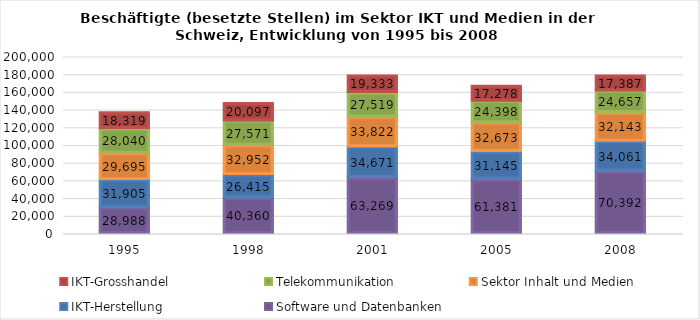
| Category | Software und Datenbanken | IKT-Herstellung | Sektor Inhalt und Medien | Telekommunikation | IKT-Grosshandel |
|---|---|---|---|---|---|
| 1995.0 | 28988 | 31905 | 29695 | 28040 | 18319 |
| 1998.0 | 40360 | 26415 | 32952 | 27571 | 20097 |
| 2001.0 | 63269 | 34671 | 33822 | 27519 | 19333 |
| 2005.0 | 61381 | 31145 | 32673 | 24398 | 17278 |
| 2008.0 | 70392 | 34061 | 32143 | 24657 | 17387 |